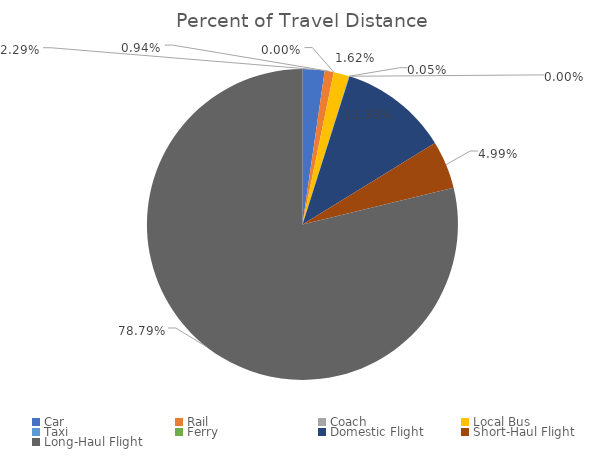
| Category | Percent of Travel Distance |
|---|---|
| Car | 0.023 |
| Rail | 0.009 |
| Coach | 0 |
| Local Bus | 0.016 |
| Taxi | 0 |
| Ferry | 0 |
| Domestic Flight | 0.113 |
| Short-Haul Flight | 0.05 |
| Long-Haul Flight | 0.788 |